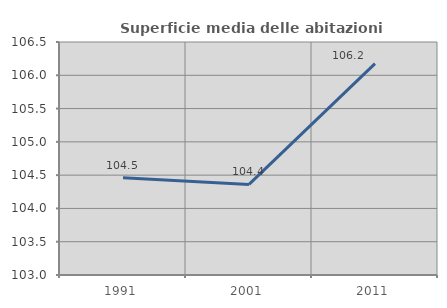
| Category | Superficie media delle abitazioni occupate |
|---|---|
| 1991.0 | 104.462 |
| 2001.0 | 104.361 |
| 2011.0 | 106.175 |